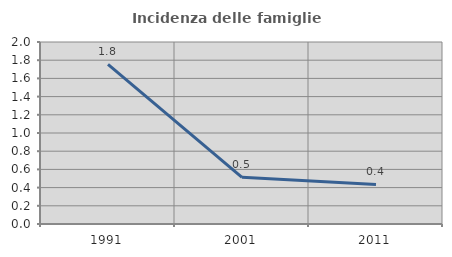
| Category | Incidenza delle famiglie numerose |
|---|---|
| 1991.0 | 1.754 |
| 2001.0 | 0.513 |
| 2011.0 | 0.435 |